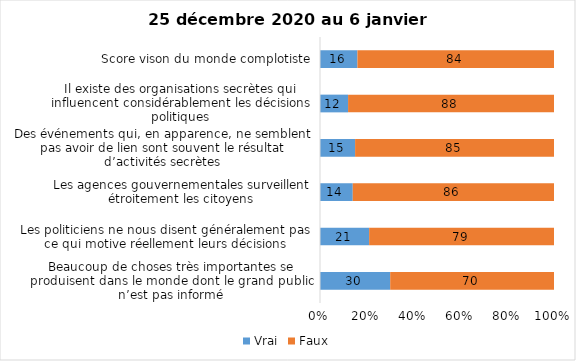
| Category | Vrai | Faux |
|---|---|---|
| Beaucoup de choses très importantes se produisent dans le monde dont le grand public n’est pas informé | 30 | 70 |
| Les politiciens ne nous disent généralement pas ce qui motive réellement leurs décisions | 21 | 79 |
| Les agences gouvernementales surveillent étroitement les citoyens | 14 | 86 |
| Des événements qui, en apparence, ne semblent pas avoir de lien sont souvent le résultat d’activités secrètes | 15 | 85 |
| Il existe des organisations secrètes qui influencent considérablement les décisions politiques | 12 | 88 |
| Score vison du monde complotiste | 16 | 84 |